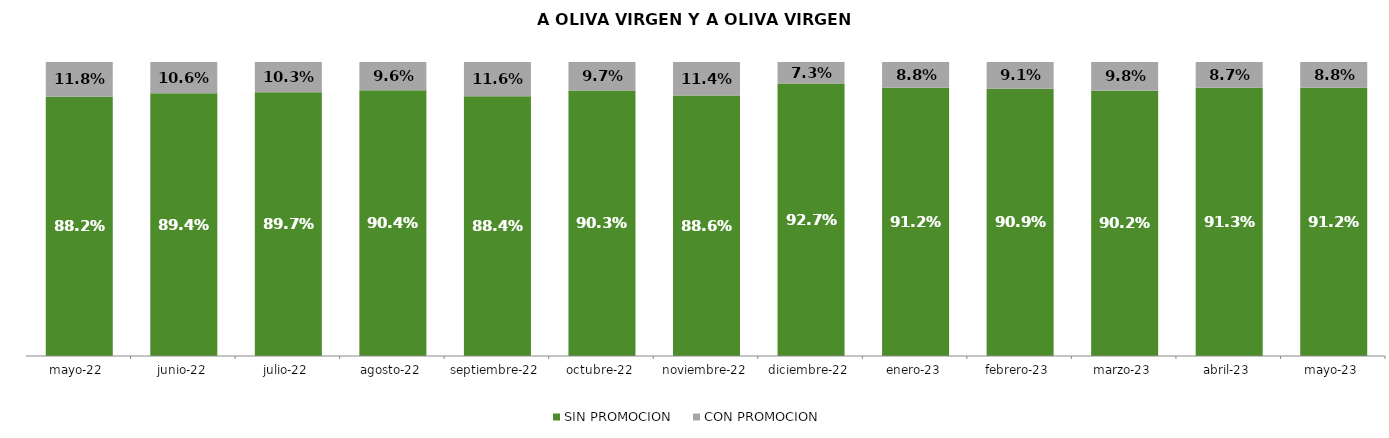
| Category | SIN PROMOCION   | CON PROMOCION   |
|---|---|---|
| 2022-05-01 | 0.882 | 0.118 |
| 2022-06-01 | 0.894 | 0.106 |
| 2022-07-01 | 0.897 | 0.103 |
| 2022-08-01 | 0.904 | 0.096 |
| 2022-09-01 | 0.884 | 0.116 |
| 2022-10-01 | 0.903 | 0.097 |
| 2022-11-01 | 0.886 | 0.114 |
| 2022-12-01 | 0.927 | 0.073 |
| 2023-01-01 | 0.912 | 0.088 |
| 2023-02-01 | 0.909 | 0.091 |
| 2023-03-01 | 0.902 | 0.098 |
| 2023-04-01 | 0.913 | 0.087 |
| 2023-05-01 | 0.912 | 0.088 |